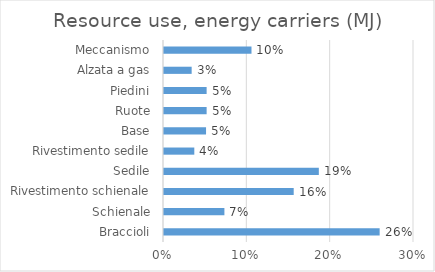
| Category | Resource use, energy carriers (MJ) |
|---|---|
| Braccioli | 0.259 |
| Schienale | 0.072 |
| Rivestimento schienale | 0.156 |
| Sedile | 0.186 |
| Rivestimento sedile | 0.036 |
| Base | 0.05 |
| Ruote | 0.051 |
| Piedini | 0.051 |
| Alzata a gas | 0.033 |
| Meccanismo | 0.105 |